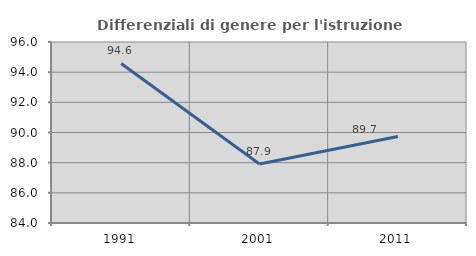
| Category | Differenziali di genere per l'istruzione superiore |
|---|---|
| 1991.0 | 94.58 |
| 2001.0 | 87.916 |
| 2011.0 | 89.729 |